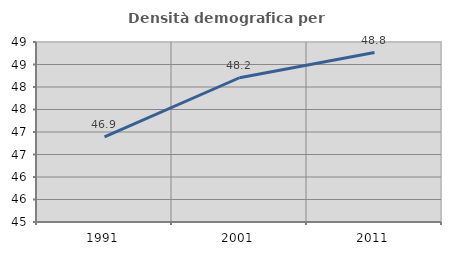
| Category | Densità demografica |
|---|---|
| 1991.0 | 46.892 |
| 2001.0 | 48.206 |
| 2011.0 | 48.766 |